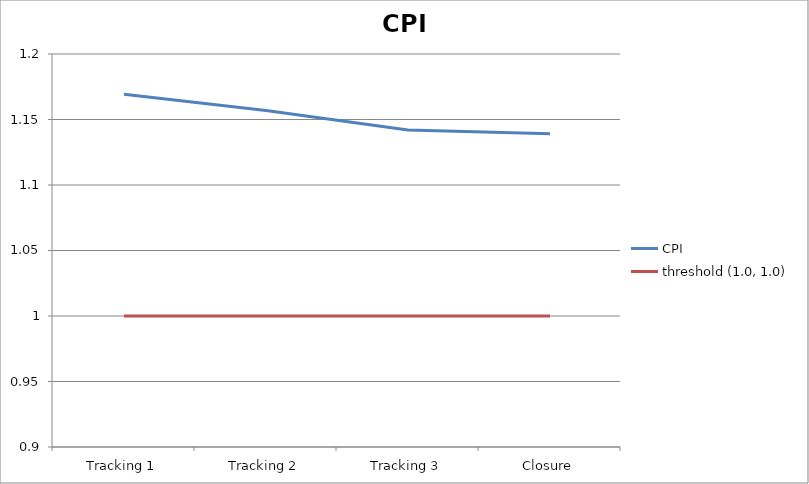
| Category | CPI | threshold (1.0, 1.0) |
|---|---|---|
| Tracking 1 | 1.169 | 1 |
| Tracking 2 | 1.157 | 1 |
| Tracking 3 | 1.142 | 1 |
| Closure | 1.139 | 1 |